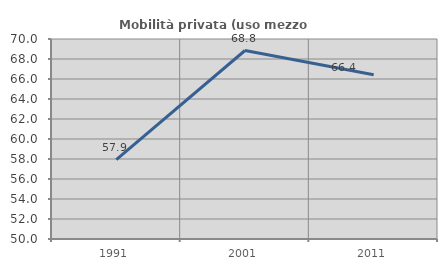
| Category | Mobilità privata (uso mezzo privato) |
|---|---|
| 1991.0 | 57.947 |
| 2001.0 | 68.848 |
| 2011.0 | 66.43 |